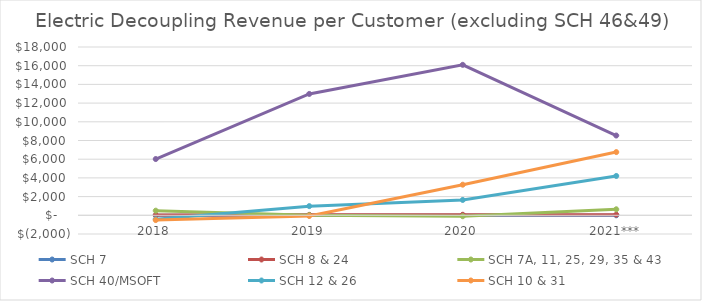
| Category | SCH 7 | SCH 8 & 24 | SCH 7A, 11, 25, 29, 35 & 43 | SCH 40/MSOFT | SCH 12 & 26 | SCH 10 & 31 |
|---|---|---|---|---|---|---|
| 2018 | -2.879 | 26.998 | 495.401 | 6018.449 | -414.088 | -510.441 |
| 2019 | -0.967 | 48.231 | 10.49 | 12981.056 | 980.708 | -71.432 |
| 2020 | 7.764 | 57.364 | -98.394 | 16092.367 | 1642.855 | 3273.565 |
| 2021*** | 0.568 | 69.661 | 642.374 | 8532.699 | 4207.611 | 6760.917 |